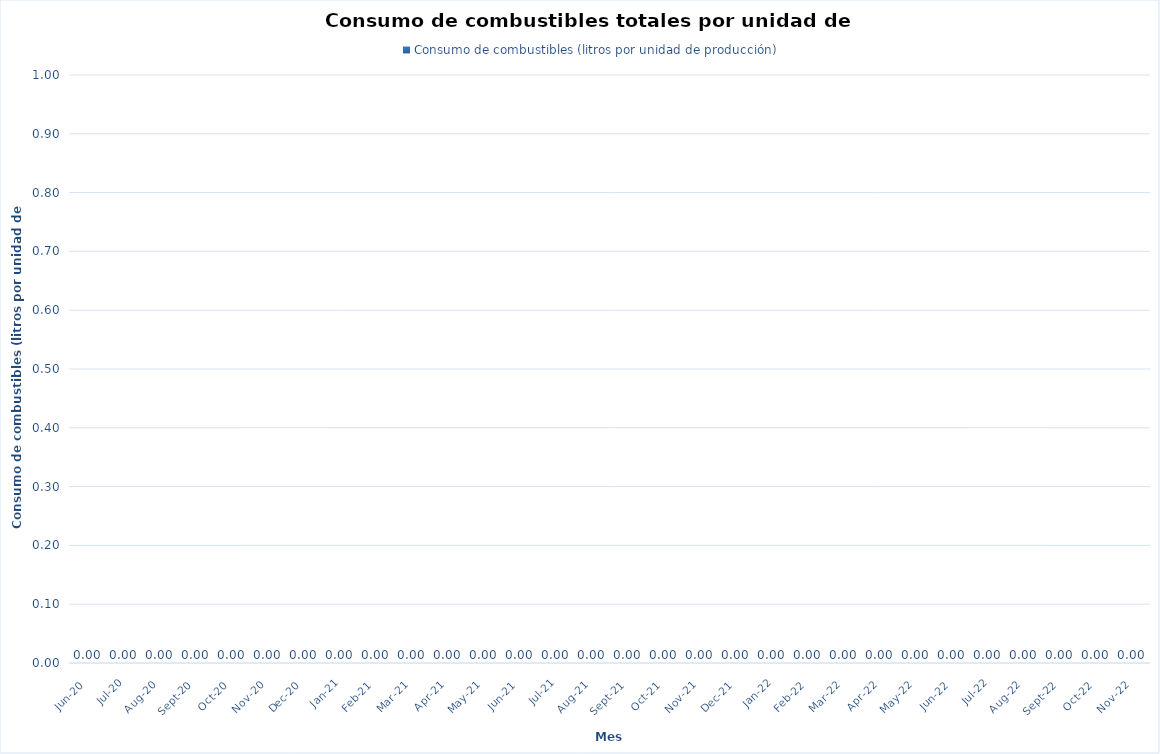
| Category | Consumo de combustibles (litros por unidad de producción) |
|---|---|
| 2020-06-01 | 0 |
| 2020-07-01 | 0 |
| 2020-08-01 | 0 |
| 2020-09-01 | 0 |
| 2020-10-01 | 0 |
| 2020-11-01 | 0 |
| 2020-12-01 | 0 |
| 2021-01-01 | 0 |
| 2021-02-01 | 0 |
| 2021-03-01 | 0 |
| 2021-04-01 | 0 |
| 2021-05-01 | 0 |
| 2021-06-01 | 0 |
| 2021-07-01 | 0 |
| 2021-08-01 | 0 |
| 2021-09-01 | 0 |
| 2021-10-01 | 0 |
| 2021-11-01 | 0 |
| 2021-12-01 | 0 |
| 2022-01-01 | 0 |
| 2022-02-01 | 0 |
| 2022-03-01 | 0 |
| 2022-04-01 | 0 |
| 2022-05-01 | 0 |
| 2022-06-01 | 0 |
| 2022-07-01 | 0 |
| 2022-08-01 | 0 |
| 2022-09-01 | 0 |
| 2022-10-01 | 0 |
| 2022-11-01 | 0 |